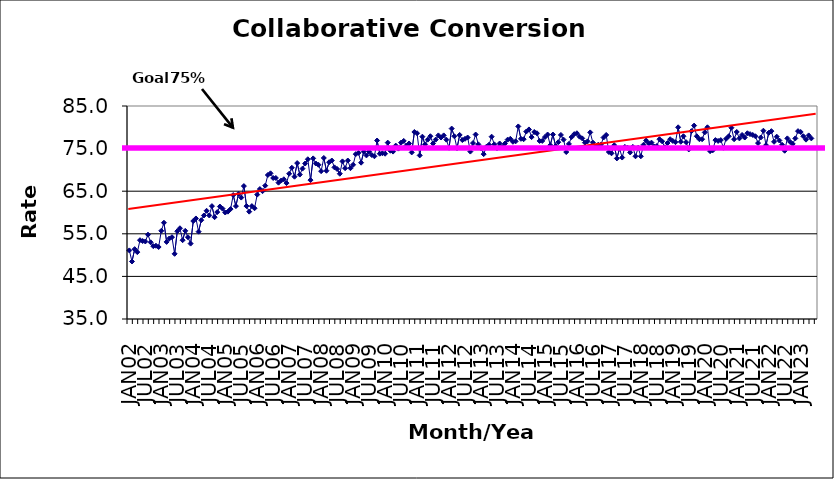
| Category | Series 0 |
|---|---|
| JAN02 | 51.1 |
| FEB02 | 48.5 |
| MAR02 | 51.4 |
| APR02 | 50.7 |
| MAY02 | 53.5 |
| JUN02 | 53.3 |
| JUL02 | 53.2 |
| AUG02 | 54.8 |
| SEP02 | 53 |
| OCT02 | 52.1 |
| NOV02 | 52.2 |
| DEC02 | 51.9 |
| JAN03 | 55.7 |
| FEB03 | 57.6 |
| MAR03 | 53.1 |
| APR03 | 53.9 |
| MAY03 | 54.2 |
| JUN03 | 50.3 |
| JUL03 | 55.6 |
| AUG03 | 56.3 |
| SEP03 | 53.5 |
| OCT03 | 55.7 |
| NOV03 | 54.2 |
| DEC03 | 52.7 |
| JAN04 | 58 |
| FEB04 | 58.6 |
| MAR04 | 55.5 |
| APR04 | 58.2 |
| MAY04 | 59.3 |
| JUN04 | 60.4 |
| JUL04 | 59.3 |
| AUG04 | 61.5 |
| SEP04 | 58.9 |
| OCT04 | 60.1 |
| NOV04 | 61.4 |
| DEC04 | 60.9 |
| JAN05 | 60 |
| FEB05 | 60.2 |
| MAR05 | 60.8 |
| APR05 | 64.1 |
| MAY05 | 61.5 |
| JUN05 | 64.4 |
| JUL05 | 63.5 |
| AUG05 | 66.2 |
| SEP05 | 61.5 |
| OCT05 | 60.2 |
| NOV05 | 61.5 |
| DEC05 | 61 |
| JAN06 | 64.2 |
| FEB06 | 65.5 |
| MAR06 | 65 |
| APR06 | 66.3 |
| MAY06 | 68.8 |
| JUN06 | 69.2 |
| JUL06 | 68.1 |
| AUG06 | 68.1 |
| SEP06 | 67 |
| OCT06 | 67.5 |
| NOV06 | 67.8 |
| DEC06 | 66.9 |
| JAN07 | 69.1 |
| FEB07 | 70.5 |
| MAR07 | 68.4 |
| APR07 | 71.6 |
| MAY07 | 68.9 |
| JUN07 | 70.3 |
| JUL07 | 71.5 |
| AUG07 | 72.5 |
| SEP07 | 67.6 |
| OCT07 | 72.7 |
| NOV07 | 71.5 |
| DEC07 | 71.2 |
| JAN08 | 69.7 |
| FEB08 | 72.8 |
| MAR08 | 69.8 |
| APR08 | 71.8 |
| MAY08 | 72.2 |
| JUN08 | 70.6 |
| JUL08 | 70.2 |
| AUG08 | 69.1 |
| SEP08 | 72 |
| OCT08 | 70.4 |
| NOV08 | 72.2 |
| DEC08 | 70.4 |
| JAN09 | 71.2 |
| FEB09 | 73.7 |
| MAR09 | 74 |
| APR09 | 71.7 |
| MAY09 | 74.3 |
| JUN09 | 73.4 |
| JUL09 | 74.3 |
| AUG09 | 73.5 |
| SEP09 | 73.2 |
| OCT09 | 76.9 |
| NOV09 | 73.8 |
| DEC09 | 73.9 |
| JAN10 | 73.8 |
| FEB10 | 76.4 |
| MAR10 | 74.5 |
| APR10 | 74.3 |
| MAY10 | 75.7 |
| JUN10 | 75 |
| JUL10 | 76.4 |
| AUG10 | 76.8 |
| SEP10 | 75.7 |
| OCT10 | 76.2 |
| NOV10 | 74.1 |
| DEC10 | 78.9 |
| JAN11 | 78.6 |
| FEB11 | 73.4 |
| MAR11 | 77.8 |
| APR11 | 76 |
| MAY11 | 77.1 |
| JUN11 | 77.9 |
| JUL11 | 76.2 |
| AUG11 | 77.1 |
| SEP11 | 78.1 |
| OCT11 | 77.6 |
| NOV11 | 78.1 |
| DEC11 | 77.1 |
| JAN12 | 75.2 |
| FEB12 | 79.7 |
| MAR12 | 77.9 |
| APR12 | 75.1 |
| MAY12 | 78.2 |
| JUN12 | 77 |
| JUL12 | 77.3 |
| AUG12 | 77.6 |
| SEP12 | 74.3 |
| OCT12 | 76.3 |
| NOV12 | 78.3 |
| DEC12 | 76 |
| JAN13 | 75.1 |
| FEB13 | 73.7 |
| MAR13 | 75.4 |
| APR13 | 75.9 |
| MAY13 | 77.8 |
| JUN13 | 76 |
| JUL13 | 75.1 |
| AUG13 | 76.2 |
| SEP13 | 75.4 |
| OCT13 | 76.2 |
| NOV13 | 77.1 |
| DEC13 | 77.3 |
| JAN14 | 76.6 |
| FEB14 | 76.7 |
| MAR14 | 80.2 |
| APR14 | 77.3 |
| MAY14 | 77.2 |
| JUN14 | 79 |
| JUL14 | 79.5 |
| AUG14 | 77.7 |
| SEP14 | 78.9 |
| OCT14 | 78.6 |
| NOV14 | 76.8 |
| DEC14 | 76.8 |
| JAN15 | 77.7 |
| FEB15 | 78.3 |
| MAR15 | 75.8 |
| APR15 | 78.3 |
| MAY15 | 75.6 |
| JUN15 | 76.5 |
| JUL15 | 78.2 |
| AUG15 | 77.1 |
| SEP15 | 74.2 |
| OCT15 | 76.1 |
| NOV15 | 77.7 |
| DEC15 | 78.4 |
| JAN16 | 78.6 |
| FEB16 | 77.8 |
| MAR16 | 77.4 |
| APR16 | 76.4 |
| MAY16 | 76.7 |
| JUN16 | 78.8 |
| JUL16 | 76.4 |
| AUG16 | 75.5 |
| SEP16 | 75.9 |
| OCT16 | 75.9 |
| NOV16 | 77.6 |
| DEC16 | 78.2 |
| JAN17 | 74.2 |
| FEB17 | 73.9 |
| MAR17 | 75.8 |
| APR17 | 72.7 |
| MAY17 | 75 |
| JUN17 | 72.9 |
| JUL17 | 75.4 |
| AUG17 | 75.2 |
| SEP17 | 74.1 |
| OCT17 | 75.4 |
| NOV17 | 73.2 |
| DEC17 | 75.2 |
| JAN18 | 73.2 |
| FEB18 | 75.9 |
| MAR18 | 76.9 |
| APR18 | 76.2 |
| MAY18 | 76.4 |
| JUN18 | 75.5 |
| JUL18 | 75.6 |
| AUG18 | 77.2 |
| SEP18 | 76.7 |
| OCT18 | 75.3 |
| NOV18 | 76.3 |
| DEC18 | 77.2 |
| JAN19 | 76.8 |
| FEB19 | 76.5 |
| MAR19 | 80 |
| APR19 | 76.6 |
| MAY19 | 77.9 |
| JUN19 | 76.5 |
| JUL19 | 74.8 |
| AUG19 | 79.1 |
| SEP19 | 80.4 |
| OCT19 | 77.9 |
| NOV19 | 77.2 |
| DEC19 | 77.2 |
| JAN20 | 78.8 |
| FEB20 | 80 |
| MAR20 | 74.4 |
| APR20 | 74.6 |
| MAY20 | 77 |
| JUN20 | 76.8 |
| JUL20 | 77 |
| AUG20 | 75.2 |
| SEP20 | 77.3 |
| OCT20 | 77.9 |
| NOV20 | 79.9 |
| DEC20 | 77.2 |
| JAN21 | 78.9 |
| FEB21 | 77.4 |
| MAR21 | 78.2 |
| APR21 | 77.6 |
| MAY21 | 78.6 |
| JUN21 | 78.4 |
| JUL21 | 78.2 |
| AUG21 | 77.9 |
| SEP21 | 76.3 |
| OCT21 | 77.6 |
| NOV21 | 79.2 |
| DEC21 | 75.8 |
| JAN22 | 78.7 |
| FEB22 | 79.1 |
| MAR22 | 76.6 |
| APR22 | 77.8 |
| MAY22 | 76.9 |
| JUN22 | 75.9 |
| JUL22 | 74.5 |
| AUG22 | 77.4 |
| SEP22 | 76.6 |
| OCT22 | 76.1 |
| NOV22 | 77.4 |
| DEC22 | 79.1 |
| JAN23 | 78.9 |
| FEB23 | 77.9 |
| MAR23 | 77.1 |
| APR23 | 78.1 |
| MAY23 | 77.4 |